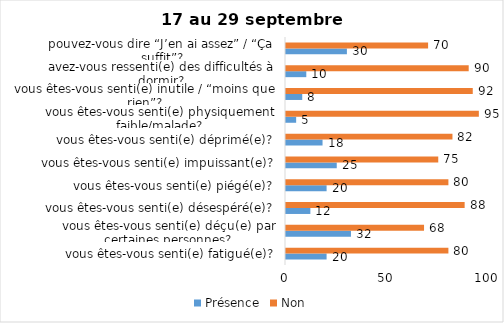
| Category | Présence | Non |
|---|---|---|
| vous êtes-vous senti(e) fatigué(e)? | 20 | 80 |
| vous êtes-vous senti(e) déçu(e) par certaines personnes? | 32 | 68 |
| vous êtes-vous senti(e) désespéré(e)? | 12 | 88 |
| vous êtes-vous senti(e) piégé(e)? | 20 | 80 |
| vous êtes-vous senti(e) impuissant(e)? | 25 | 75 |
| vous êtes-vous senti(e) déprimé(e)? | 18 | 82 |
| vous êtes-vous senti(e) physiquement faible/malade? | 5 | 95 |
| vous êtes-vous senti(e) inutile / “moins que rien”? | 8 | 92 |
| avez-vous ressenti(e) des difficultés à dormir? | 10 | 90 |
| pouvez-vous dire “J’en ai assez” / “Ça suffit”? | 30 | 70 |